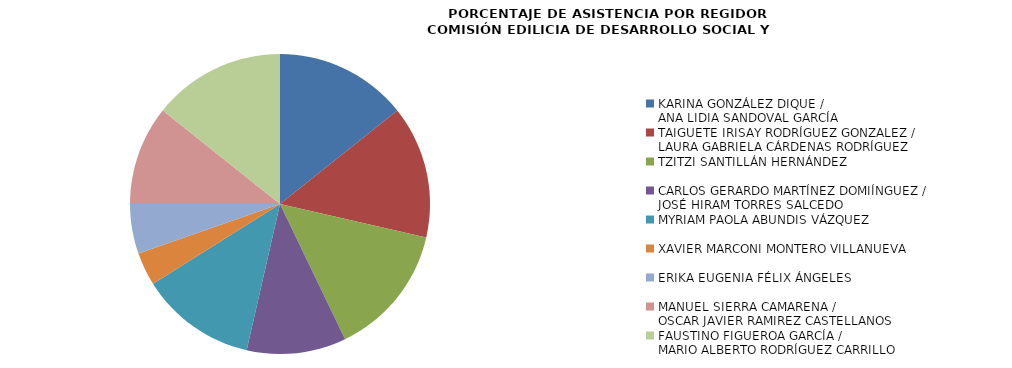
| Category | Series 0 |
|---|---|
| KARINA GONZÁLEZ DIQUE / 
ANA LIDIA SANDOVAL GARCÍA | 100 |
| TAIGUETE IRISAY RODRÍGUEZ GONZALEZ /
LAURA GABRIELA CÁRDENAS RODRÍGUEZ | 100 |
| TZITZI SANTILLÁN HERNÁNDEZ | 100 |
| CARLOS GERARDO MARTÍNEZ DOMIÍNGUEZ /
JOSÉ HIRAM TORRES SALCEDO | 75 |
| MYRIAM PAOLA ABUNDIS VÁZQUEZ | 87.5 |
| XAVIER MARCONI MONTERO VILLANUEVA | 25 |
| ERIKA EUGENIA FÉLIX ÁNGELES | 37.5 |
| MANUEL SIERRA CAMARENA /
OSCAR JAVIER RAMIREZ CASTELLANOS | 75 |
| FAUSTINO FIGUEROA GARCÍA /
MARIO ALBERTO RODRÍGUEZ CARRILLO | 100 |